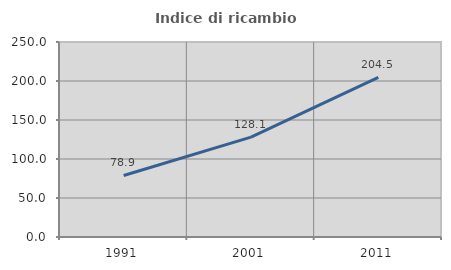
| Category | Indice di ricambio occupazionale  |
|---|---|
| 1991.0 | 78.892 |
| 2001.0 | 128.108 |
| 2011.0 | 204.522 |